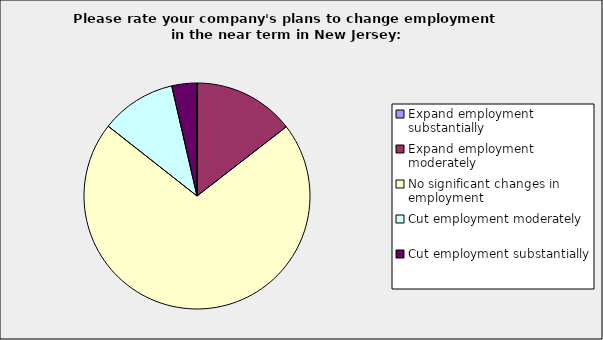
| Category | Series 0 |
|---|---|
| Expand employment substantially | 0 |
| Expand employment moderately | 0.145 |
| No significant changes in employment | 0.711 |
| Cut employment moderately | 0.108 |
| Cut employment substantially | 0.036 |